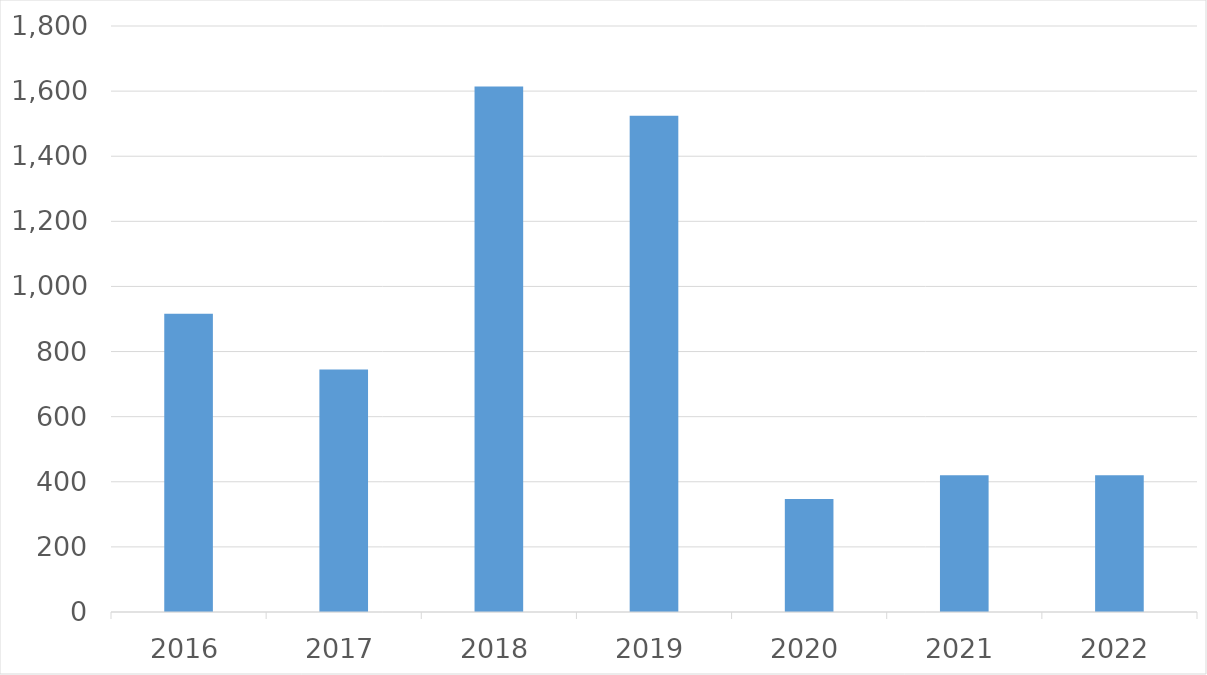
| Category | Series 0 |
|---|---|
| 2016 | 916 |
| 2017 | 745 |
| 2018 | 1614 |
| 2019 | 1524 |
| 2020 | 347 |
| 2021 | 420 |
| 2022 | 420 |